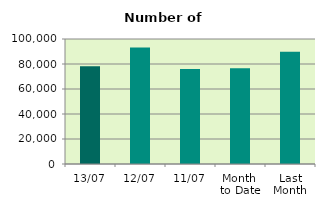
| Category | Series 0 |
|---|---|
| 13/07 | 78218 |
| 12/07 | 93128 |
| 11/07 | 76090 |
| Month 
to Date | 76659.778 |
| Last
Month | 89884.909 |